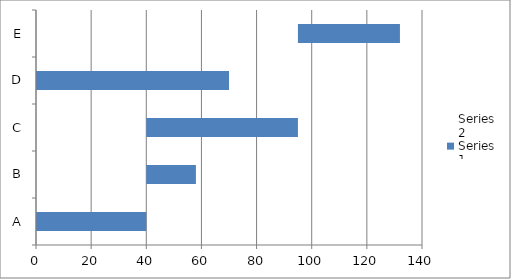
| Category | Series 1 | Series 0 |
|---|---|---|
| A | 0 | 40 |
| B | 40 | 18 |
| C | 40 | 55 |
| D | 0 | 70 |
| E | 95 | 37 |